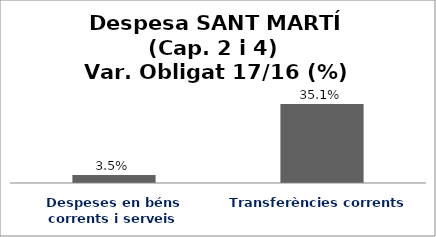
| Category | Series 0 |
|---|---|
| Despeses en béns corrents i serveis | 0.035 |
| Transferències corrents | 0.351 |